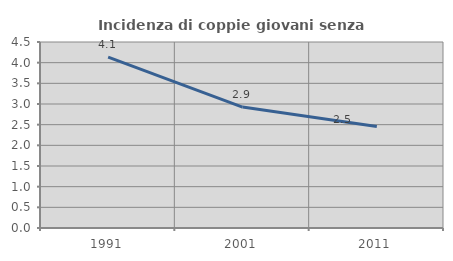
| Category | Incidenza di coppie giovani senza figli |
|---|---|
| 1991.0 | 4.136 |
| 2001.0 | 2.926 |
| 2011.0 | 2.454 |